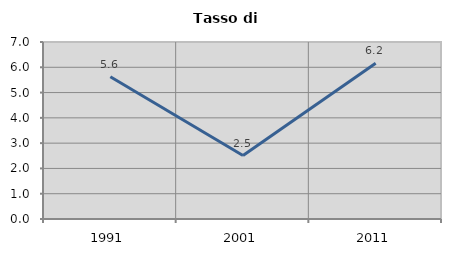
| Category | Tasso di disoccupazione   |
|---|---|
| 1991.0 | 5.622 |
| 2001.0 | 2.51 |
| 2011.0 | 6.159 |